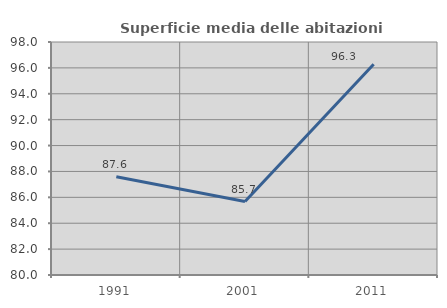
| Category | Superficie media delle abitazioni occupate |
|---|---|
| 1991.0 | 87.596 |
| 2001.0 | 85.675 |
| 2011.0 | 96.276 |